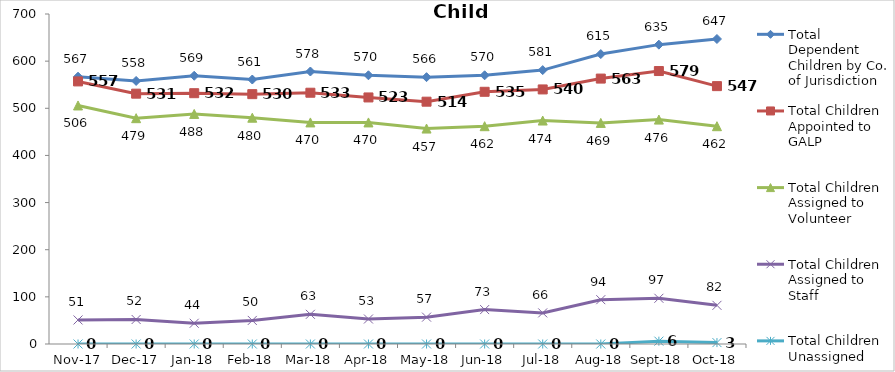
| Category | Total Dependent Children by Co. of Jurisdiction | Total Children Appointed to GALP | Total Children Assigned to Volunteer | Total Children Assigned to Staff | Total Children Unassigned |
|---|---|---|---|---|---|
| 2017-11-01 | 567 | 557 | 506 | 51 | 0 |
| 2017-12-01 | 558 | 531 | 479 | 52 | 0 |
| 2018-01-01 | 569 | 532 | 488 | 44 | 0 |
| 2018-02-01 | 561 | 530 | 480 | 50 | 0 |
| 2018-03-01 | 578 | 533 | 470 | 63 | 0 |
| 2018-04-01 | 570 | 523 | 470 | 53 | 0 |
| 2018-05-01 | 566 | 514 | 457 | 57 | 0 |
| 2018-06-01 | 570 | 535 | 462 | 73 | 0 |
| 2018-07-01 | 581 | 540 | 474 | 66 | 0 |
| 2018-08-01 | 615 | 563 | 469 | 94 | 0 |
| 2018-09-01 | 635 | 579 | 476 | 97 | 6 |
| 2018-10-01 | 647 | 547 | 462 | 82 | 3 |